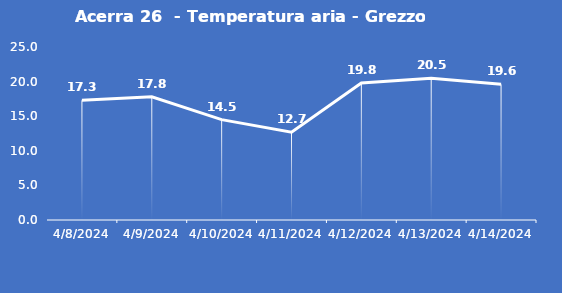
| Category | Acerra 26  - Temperatura aria - Grezzo (°C) |
|---|---|
| 4/8/24 | 17.3 |
| 4/9/24 | 17.8 |
| 4/10/24 | 14.5 |
| 4/11/24 | 12.7 |
| 4/12/24 | 19.8 |
| 4/13/24 | 20.5 |
| 4/14/24 | 19.6 |